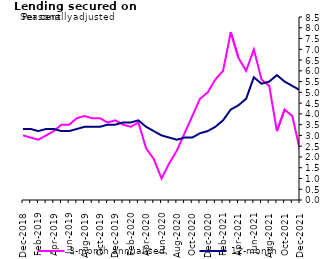
| Category | 3-month annualised | 12-month |
|---|---|---|
| Dec-2018 | 3 | 3.3 |
| Jan-2019 | 2.9 | 3.3 |
| Feb-2019 | 2.8 | 3.2 |
| Mar-2019 | 3 | 3.3 |
| Apr-2019 | 3.2 | 3.3 |
| May-2019 | 3.5 | 3.2 |
| Jun-2019 | 3.5 | 3.2 |
| Jul-2019 | 3.8 | 3.3 |
| Aug-2019 | 3.9 | 3.4 |
| Sep-2019 | 3.8 | 3.4 |
| Oct-2019 | 3.8 | 3.4 |
| Nov-2019 | 3.6 | 3.5 |
| Dec-2019 | 3.7 | 3.5 |
| Jan-2020 | 3.5 | 3.6 |
| Feb-2020 | 3.4 | 3.6 |
| Mar-2020 | 3.6 | 3.7 |
| Apr-2020 | 2.4 | 3.4 |
| May-2020 | 1.9 | 3.2 |
| Jun-2020 | 1 | 3 |
| Jul-2020 | 1.7 | 2.9 |
| Aug-2020 | 2.3 | 2.8 |
| Sep-2020 | 3.1 | 2.9 |
| Oct-2020 | 3.9 | 2.9 |
| Nov-2020 | 4.7 | 3.1 |
| Dec-2020 | 5 | 3.2 |
| Jan-2021 | 5.6 | 3.4 |
| Feb-2021 | 6 | 3.7 |
| Mar-2021 | 7.8 | 4.2 |
| Apr-2021 | 6.6 | 4.4 |
| May-2021 | 6 | 4.7 |
| Jun-2021 | 7 | 5.7 |
| Jul-2021 | 5.6 | 5.4 |
| Aug-2021 | 5.3 | 5.5 |
| Sep-2021 | 3.2 | 5.8 |
| Oct-2021 | 4.2 | 5.5 |
| Nov-2021 | 3.9 | 5.3 |
| Dec-2021 | 2.3 | 5.1 |